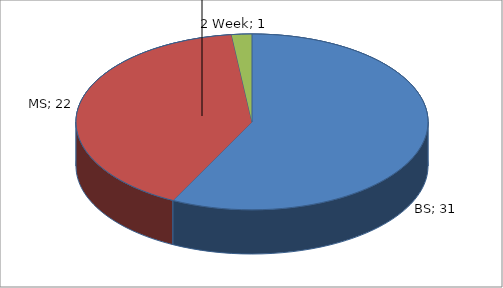
| Category | Series 0 |
|---|---|
| BS | 31 |
| MS | 22 |
| 2 Week | 1 |